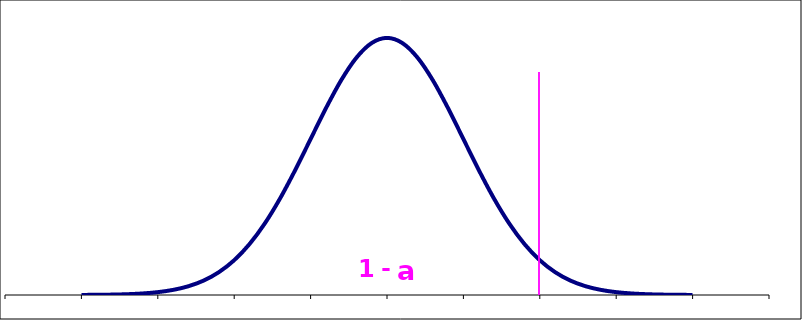
| Category | Series 0 |
|---|---|
| -4.0 | 0 |
| -3.8 | 0 |
| -3.6 | 0.001 |
| -3.4 | 0.001 |
| -3.2 | 0.002 |
| -3.0 | 0.004 |
| -2.8 | 0.008 |
| -2.6 | 0.014 |
| -2.4 | 0.022 |
| -2.2 | 0.035 |
| -2.0 | 0.054 |
| -1.8 | 0.079 |
| -1.6 | 0.111 |
| -1.4 | 0.15 |
| -1.2 | 0.194 |
| -0.9999999999999987 | 0.242 |
| -0.7999999999999987 | 0.29 |
| -0.5999999999999988 | 0.333 |
| -0.39999999999999875 | 0.368 |
| -0.19999999999999873 | 0.391 |
| 1.27675647831893e-15 | 0.399 |
| 0.2000000000000013 | 0.391 |
| 0.4000000000000013 | 0.368 |
| 0.6000000000000013 | 0.333 |
| 0.8000000000000014 | 0.29 |
| 1.0 | 0.242 |
| 1.2 | 0.194 |
| 1.4 | 0.15 |
| 1.6 | 0.111 |
| 1.8 | 0.079 |
| 2.0 | 0.054 |
| 2.2 | 0.035 |
| 2.4 | 0.022 |
| 2.6 | 0.014 |
| 2.8 | 0.008 |
| 3.0 | 0.004 |
| 3.2 | 0.002 |
| 3.4 | 0.001 |
| 3.6 | 0.001 |
| 3.8 | 0 |
| 4.0 | 0 |